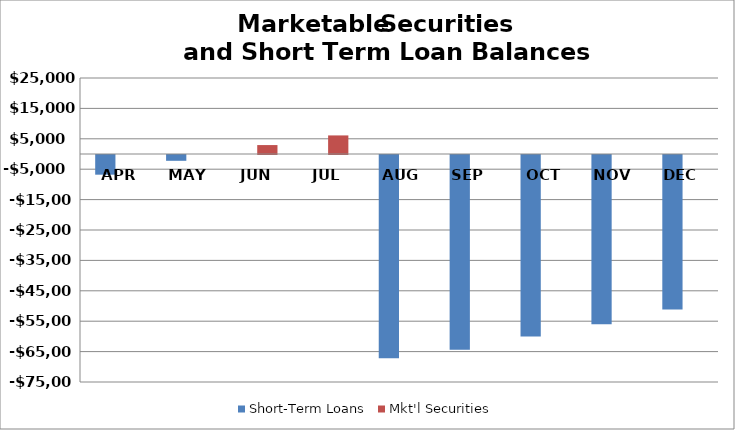
| Category | Short-Term Loans | Mkt'l Securities |
|---|---|---|
| APR | -6475 | 0 |
| MAY | -1912.5 | 0 |
| JUN | 0 | 2937.5 |
| JUL | 0 | 6112.5 |
| AUG | -66837.5 | 0 |
| SEP | -64037.5 | 0 |
| OCT | -59737.5 | 0 |
| NOV | -55712.5 | 0 |
| DEC | -50837.5 | 0 |